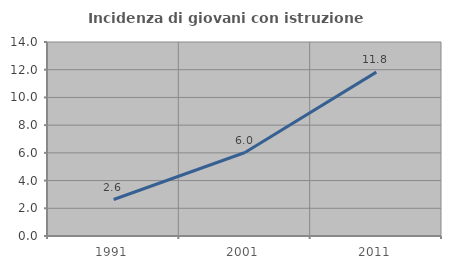
| Category | Incidenza di giovani con istruzione universitaria |
|---|---|
| 1991.0 | 2.632 |
| 2001.0 | 6.024 |
| 2011.0 | 11.828 |